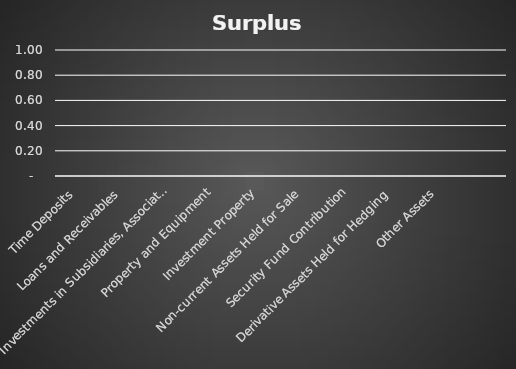
| Category | Series 3 |
|---|---|
| Time Deposits | 0 |
| Loans and Receivables | 0 |
| Investments in Subsidiaries, Associates and Joint Ventures | 0 |
| Property and Equipment | 0 |
| Investment Property | 0 |
| Non-current Assets Held for Sale | 0 |
| Security Fund Contribution | 0 |
| Derivative Assets Held for Hedging | 0 |
| Other Assets | 0 |